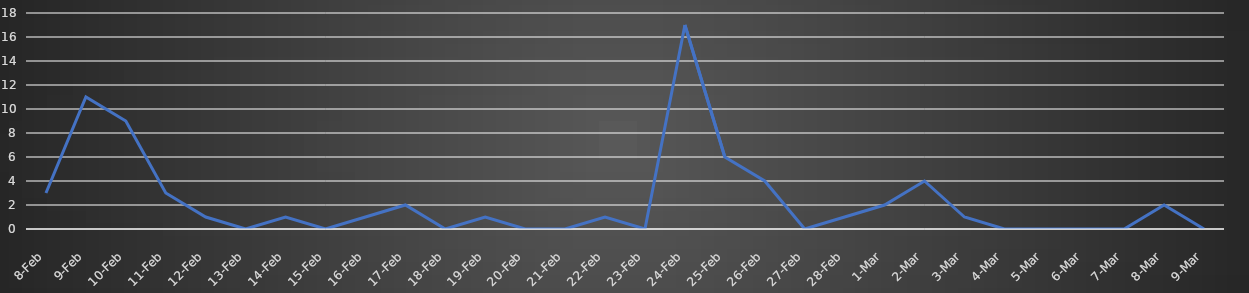
| Category | Count |
|---|---|
| 2021-02-08 | 3 |
| 2021-02-09 | 11 |
| 2021-02-10 | 9 |
| 2021-02-11 | 3 |
| 2021-02-12 | 1 |
| 2021-02-13 | 0 |
| 2021-02-14 | 1 |
| 2021-02-15 | 0 |
| 2021-02-16 | 1 |
| 2021-02-17 | 2 |
| 2021-02-18 | 0 |
| 2021-02-19 | 1 |
| 2021-02-20 | 0 |
| 2021-02-21 | 0 |
| 2021-02-22 | 1 |
| 2021-02-23 | 0 |
| 2021-02-24 | 17 |
| 2021-02-25 | 6 |
| 2021-02-26 | 4 |
| 2021-02-27 | 0 |
| 2021-02-28 | 1 |
| 2021-03-01 | 2 |
| 2021-03-02 | 4 |
| 2021-03-03 | 1 |
| 2021-03-04 | 0 |
| 2021-03-05 | 0 |
| 2021-03-06 | 0 |
| 2021-03-07 | 0 |
| 2021-03-08 | 2 |
| 2021-03-09 | 0 |